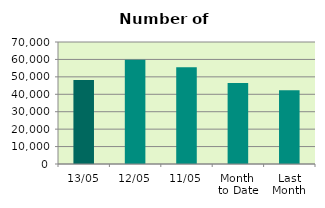
| Category | Series 0 |
|---|---|
| 13/05 | 48232 |
| 12/05 | 59856 |
| 11/05 | 55514 |
| Month 
to Date | 46453.111 |
| Last
Month | 42252.3 |